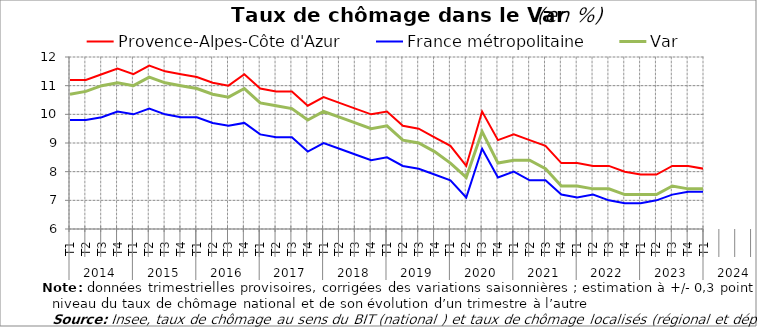
| Category | Provence-Alpes-Côte d'Azur | France métropolitaine | Var |
|---|---|---|---|
| 0 | 11.2 | 9.8 | 10.7 |
| 1 | 11.2 | 9.8 | 10.8 |
| 2 | 11.4 | 9.9 | 11 |
| 3 | 11.6 | 10.1 | 11.1 |
| 4 | 11.4 | 10 | 11 |
| 5 | 11.7 | 10.2 | 11.3 |
| 6 | 11.5 | 10 | 11.1 |
| 7 | 11.4 | 9.9 | 11 |
| 8 | 11.3 | 9.9 | 10.9 |
| 9 | 11.1 | 9.7 | 10.7 |
| 10 | 11 | 9.6 | 10.6 |
| 11 | 11.4 | 9.7 | 10.9 |
| 12 | 10.9 | 9.3 | 10.4 |
| 13 | 10.8 | 9.2 | 10.3 |
| 14 | 10.8 | 9.2 | 10.2 |
| 15 | 10.3 | 8.7 | 9.8 |
| 16 | 10.6 | 9 | 10.1 |
| 17 | 10.4 | 8.8 | 9.9 |
| 18 | 10.2 | 8.6 | 9.7 |
| 19 | 10 | 8.4 | 9.5 |
| 20 | 10.1 | 8.5 | 9.6 |
| 21 | 9.6 | 8.2 | 9.1 |
| 22 | 9.5 | 8.1 | 9 |
| 23 | 9.2 | 7.9 | 8.7 |
| 24 | 8.9 | 7.7 | 8.3 |
| 25 | 8.2 | 7.1 | 7.8 |
| 26 | 10.1 | 8.8 | 9.4 |
| 27 | 9.1 | 7.8 | 8.3 |
| 28 | 9.3 | 8 | 8.4 |
| 29 | 9.1 | 7.7 | 8.4 |
| 30 | 8.9 | 7.7 | 8.1 |
| 31 | 8.3 | 7.2 | 7.5 |
| 32 | 8.3 | 7.1 | 7.5 |
| 33 | 8.2 | 7.2 | 7.4 |
| 34 | 8.2 | 7 | 7.4 |
| 35 | 8 | 6.9 | 7.2 |
| 36 | 7.9 | 6.9 | 7.2 |
| 37 | 7.9 | 7 | 7.2 |
| 38 | 8.2 | 7.2 | 7.5 |
| 39 | 8.2 | 7.3 | 7.4 |
| 40 | 8.1 | 7.3 | 7.4 |